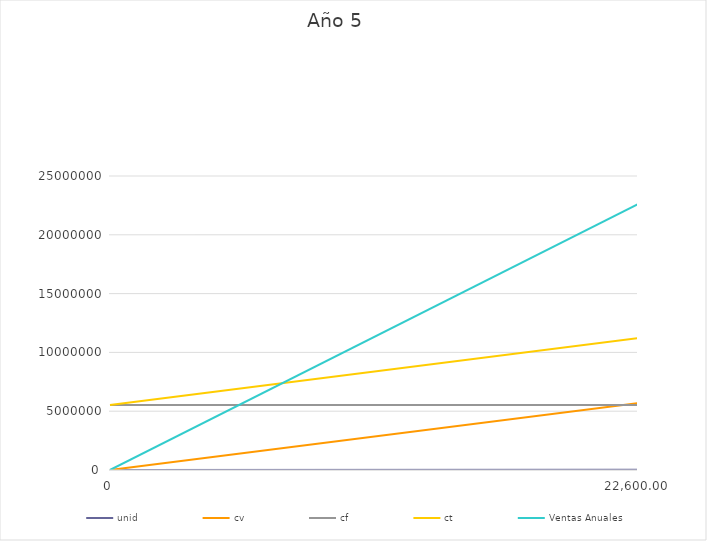
| Category | unid | cv | cf | ct | Ventas Anuales |
|---|---|---|---|---|---|
| 0.0 | 0 | 0 | 5525314.549 | 5525314.549 | 0 |
| 22600.0 | 22600 | 5684170.638 | 5525314.549 | 11209485.187 | 22600000 |